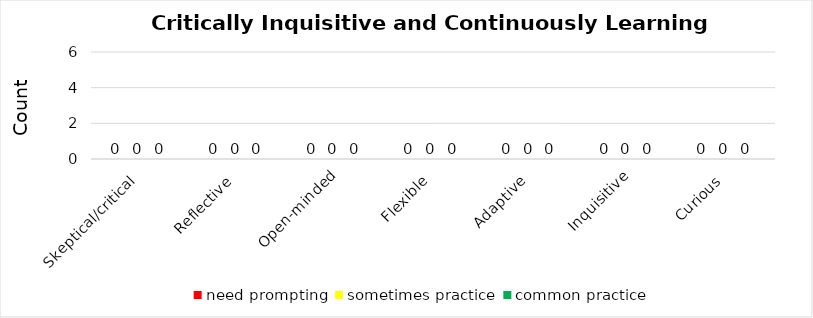
| Category | need prompting | sometimes practice | common practice |
|---|---|---|---|
| Skeptical/critical | 0 | 0 | 0 |
| Reflective | 0 | 0 | 0 |
| Open-minded | 0 | 0 | 0 |
| Flexible | 0 | 0 | 0 |
| Adaptive | 0 | 0 | 0 |
| Inquisitive | 0 | 0 | 0 |
| Curious | 0 | 0 | 0 |